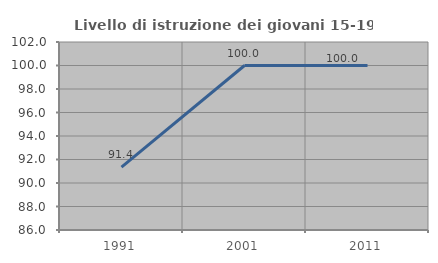
| Category | Livello di istruzione dei giovani 15-19 anni |
|---|---|
| 1991.0 | 91.351 |
| 2001.0 | 100 |
| 2011.0 | 100 |